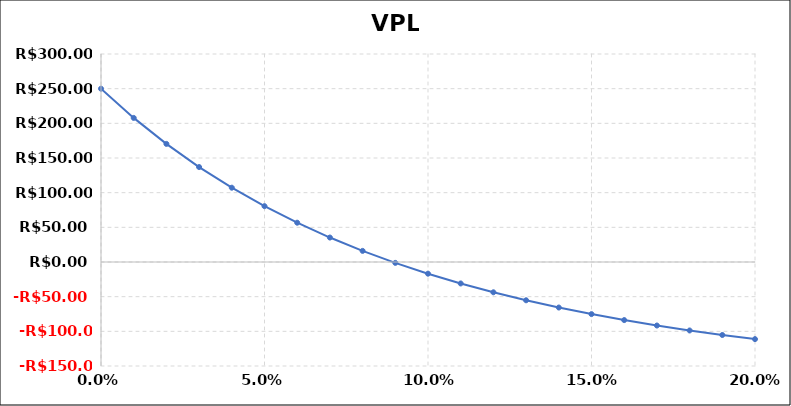
| Category | VPL |
|---|---|
| 0.0 | 250 |
| 0.01 | 207.826 |
| 0.02 | 170.337 |
| 0.03 | 136.948 |
| 0.04 | 107.154 |
| 0.05 | 80.52 |
| 0.06 | 56.667 |
| 0.07 | 35.269 |
| 0.08 | 16.042 |
| 0.09 | -1.264 |
| 0.1 | -16.864 |
| 0.11 | -30.948 |
| 0.12 | -43.681 |
| 0.13 | -55.21 |
| 0.14 | -65.661 |
| 0.15 | -75.149 |
| 0.16 | -83.771 |
| 0.17 | -91.617 |
| 0.18 | -98.764 |
| 0.19 | -105.282 |
| 0.2 | -111.231 |